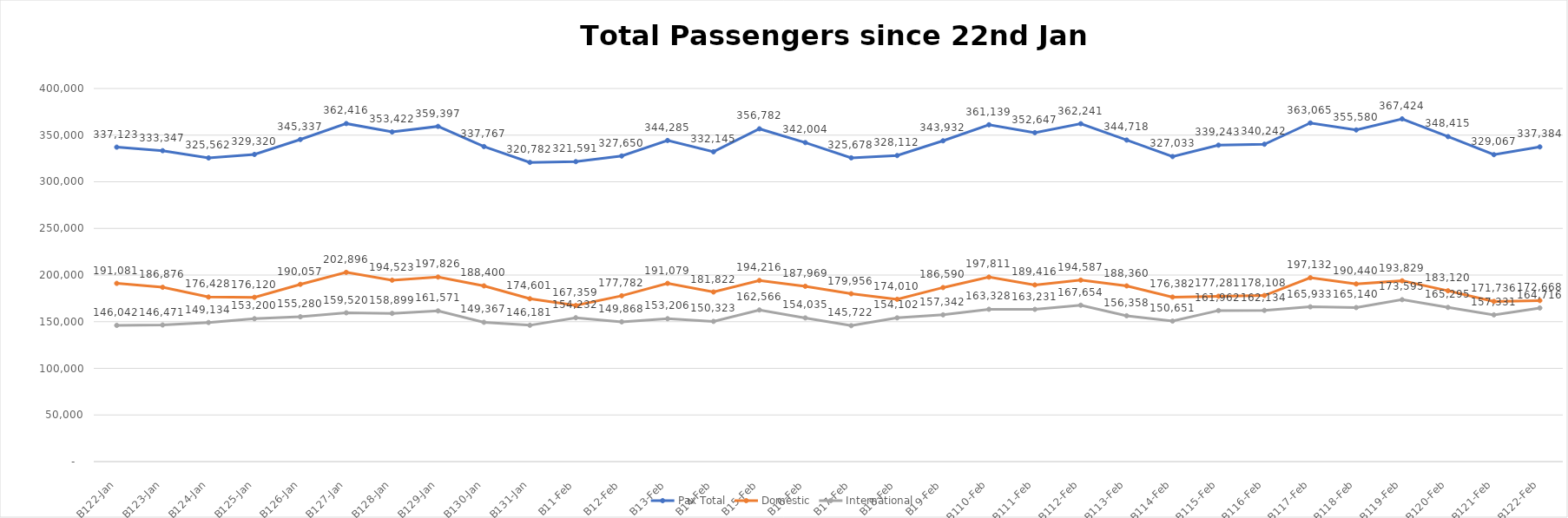
| Category | Pax Total |  Domestic  |  International  |
|---|---|---|---|
| 2023-01-22 | 337123 | 191081 | 146042 |
| 2023-01-23 | 333347 | 186876 | 146471 |
| 2023-01-24 | 325562 | 176428 | 149134 |
| 2023-01-25 | 329320 | 176120 | 153200 |
| 2023-01-26 | 345337 | 190057 | 155280 |
| 2023-01-27 | 362416 | 202896 | 159520 |
| 2023-01-28 | 353422 | 194523 | 158899 |
| 2023-01-29 | 359397 | 197826 | 161571 |
| 2023-01-30 | 337767 | 188400 | 149367 |
| 2023-01-31 | 320782 | 174601 | 146181 |
| 2023-02-01 | 321591 | 167359 | 154232 |
| 2023-02-02 | 327650 | 177782 | 149868 |
| 2023-02-03 | 344285 | 191079 | 153206 |
| 2023-02-04 | 332145 | 181822 | 150323 |
| 2023-02-05 | 356782 | 194216 | 162566 |
| 2023-02-06 | 342004 | 187969 | 154035 |
| 2023-02-07 | 325678 | 179956 | 145722 |
| 2023-02-08 | 328112 | 174010 | 154102 |
| 2023-02-09 | 343932 | 186590 | 157342 |
| 2023-02-10 | 361139 | 197811 | 163328 |
| 2023-02-11 | 352647 | 189416 | 163231 |
| 2023-02-12 | 362241 | 194587 | 167654 |
| 2023-02-13 | 344718 | 188360 | 156358 |
| 2023-02-14 | 327033 | 176382 | 150651 |
| 2023-02-15 | 339243 | 177281 | 161962 |
| 2023-02-16 | 340242 | 178108 | 162134 |
| 2023-02-17 | 363065 | 197132 | 165933 |
| 2023-02-18 | 355580 | 190440 | 165140 |
| 2023-02-19 | 367424 | 193829 | 173595 |
| 2023-02-20 | 348415 | 183120 | 165295 |
| 2023-02-21 | 329067 | 171736 | 157331 |
| 2023-02-22 | 337384 | 172668 | 164716 |